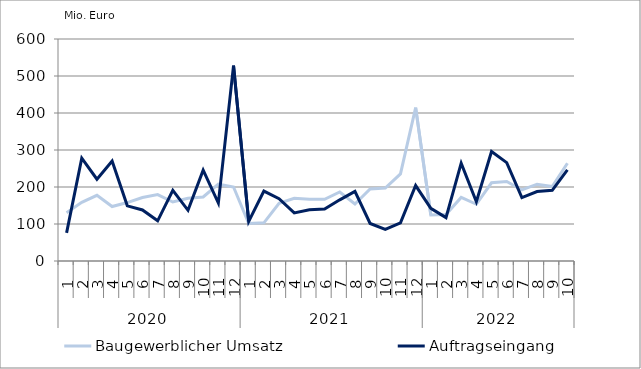
| Category | Baugewerblicher Umsatz | Auftragseingang |
|---|---|---|
| 0 | 130445.562 | 75891.481 |
| 1 | 158433.655 | 277923.85 |
| 2 | 177529.832 | 220973.626 |
| 3 | 147259.799 | 269936.091 |
| 4 | 157965.891 | 149072.895 |
| 5 | 171647.778 | 137984.76 |
| 6 | 179530.732 | 108645.965 |
| 7 | 159480.457 | 190771.468 |
| 8 | 169638.111 | 136988.906 |
| 9 | 173040.053 | 245341.603 |
| 10 | 207619.085 | 156647.224 |
| 11 | 199947.086 | 528166.004 |
| 12 | 101295.895 | 106850.127 |
| 13 | 103236.543 | 188883.434 |
| 14 | 156172.725 | 168204.42 |
| 15 | 169257.088 | 130052.073 |
| 16 | 166897.821 | 138492.214 |
| 17 | 166720.216 | 140262.426 |
| 18 | 186515.191 | 165331.191 |
| 19 | 154188.941 | 188169.655 |
| 20 | 194464.12 | 101359.538 |
| 21 | 197281.201 | 85626.862 |
| 22 | 235325.083 | 102880.924 |
| 23 | 414469.471 | 203900.676 |
| 24 | 124217.549 | 142351.759 |
| 25 | 125619.696 | 117194.423 |
| 26 | 171896.664 | 264509.013 |
| 27 | 153384.654 | 160146.519 |
| 28 | 211335.38 | 295997.826 |
| 29 | 214914.164 | 265813.917 |
| 30 | 192047.613 | 171529.517 |
| 31 | 207577.681 | 187809.656 |
| 32 | 201109.781 | 190941.096 |
| 33 | 264135.048 | 246250.021 |